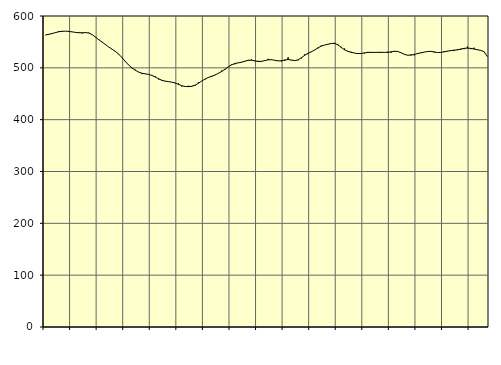
| Category | Piggar | Series 1 |
|---|---|---|
| nan | 563 | 563.58 |
| 87.0 | 565.1 | 564.72 |
| 87.0 | 565.5 | 566.22 |
| 87.0 | 567.5 | 568.09 |
| nan | 571.1 | 569.68 |
| 88.0 | 569.2 | 570.53 |
| 88.0 | 570.7 | 570.74 |
| 88.0 | 571.1 | 570.26 |
| nan | 569.1 | 569.36 |
| 89.0 | 568.6 | 568.34 |
| 89.0 | 568.3 | 567.7 |
| 89.0 | 566.3 | 567.71 |
| nan | 568.4 | 567.95 |
| 90.0 | 567.9 | 567.22 |
| 90.0 | 564.4 | 564.16 |
| 90.0 | 558.9 | 559.25 |
| nan | 553.6 | 554.25 |
| 91.0 | 550.2 | 549.6 |
| 91.0 | 545.5 | 544.87 |
| 91.0 | 540.1 | 540.17 |
| nan | 536.1 | 535.91 |
| 92.0 | 530.5 | 531.68 |
| 92.0 | 527 | 526.33 |
| 92.0 | 520.4 | 519.63 |
| nan | 511.3 | 512.28 |
| 93.0 | 505.6 | 505.3 |
| 93.0 | 499.1 | 499.74 |
| 93.0 | 496.4 | 495.35 |
| nan | 491.6 | 491.84 |
| 94.0 | 487.9 | 489.57 |
| 94.0 | 488.9 | 488.36 |
| 94.0 | 487.1 | 487.36 |
| nan | 484.8 | 485.33 |
| 95.0 | 483.7 | 482.29 |
| 95.0 | 477.7 | 478.91 |
| 95.0 | 475.1 | 476 |
| nan | 473.9 | 474.36 |
| 96.0 | 473.2 | 473.39 |
| 96.0 | 472.1 | 472.38 |
| 96.0 | 470.3 | 470.75 |
| nan | 470 | 468.12 |
| 97.0 | 464.1 | 465.45 |
| 97.0 | 463.6 | 464.02 |
| 97.0 | 465.4 | 463.77 |
| nan | 463.5 | 464.46 |
| 98.0 | 465.1 | 466.51 |
| 98.0 | 472.2 | 470.24 |
| 98.0 | 474.5 | 474.53 |
| nan | 477.5 | 478.4 |
| 99.0 | 482.3 | 481.45 |
| 99.0 | 482.5 | 483.8 |
| 99.0 | 485.9 | 486.26 |
| nan | 489.7 | 489.46 |
| 0.0 | 494.7 | 493 |
| 0.0 | 496.5 | 497.19 |
| 0.0 | 502.2 | 501.86 |
| nan | 506.8 | 505.86 |
| 1.0 | 506.8 | 508.33 |
| 1.0 | 509.3 | 509.55 |
| 1.0 | 510.1 | 510.87 |
| nan | 512.2 | 512.83 |
| 2.0 | 515.3 | 514.49 |
| 2.0 | 516.2 | 514.75 |
| 2.0 | 512.9 | 513.49 |
| nan | 513.6 | 512.19 |
| 3.0 | 511.7 | 512.54 |
| 3.0 | 513.9 | 514.02 |
| 3.0 | 517.4 | 515.45 |
| nan | 515.1 | 515.68 |
| 4.0 | 514.6 | 514.58 |
| 4.0 | 513.5 | 513.42 |
| 4.0 | 512.4 | 513.65 |
| nan | 513.4 | 515.19 |
| 5.0 | 520.5 | 515.99 |
| 5.0 | 514.4 | 515.09 |
| 5.0 | 513.7 | 513.91 |
| nan | 514.5 | 515.3 |
| 6.0 | 518.1 | 519.48 |
| 6.0 | 526 | 524.19 |
| 6.0 | 526.3 | 527.93 |
| nan | 531.6 | 530.85 |
| 7.0 | 534.1 | 534.42 |
| 7.0 | 537.5 | 538.6 |
| 7.0 | 543.2 | 541.97 |
| nan | 543.9 | 544.02 |
| 8.0 | 545.2 | 545.47 |
| 8.0 | 547.2 | 546.99 |
| 8.0 | 548.3 | 547.06 |
| nan | 545.2 | 544.32 |
| 9.0 | 540.4 | 539.35 |
| 9.0 | 537.2 | 534.84 |
| 9.0 | 531.4 | 531.88 |
| nan | 530.9 | 529.93 |
| 10.0 | 528.5 | 528.48 |
| 10.0 | 527.9 | 527.51 |
| 10.0 | 527.2 | 527.7 |
| nan | 527.8 | 528.81 |
| 11.0 | 530.8 | 529.69 |
| 11.0 | 529.2 | 529.9 |
| 11.0 | 529.1 | 529.84 |
| nan | 529.2 | 529.9 |
| 12.0 | 528.9 | 529.92 |
| 12.0 | 529.5 | 529.8 |
| 12.0 | 531.2 | 529.91 |
| nan | 528.9 | 530.79 |
| 13.0 | 532.7 | 531.89 |
| 13.0 | 531 | 531.63 |
| 13.0 | 529.4 | 529.13 |
| nan | 525.7 | 526.04 |
| 14.0 | 524 | 524.4 |
| 14.0 | 525.9 | 524.5 |
| 14.0 | 524.2 | 525.87 |
| nan | 528.7 | 527.55 |
| 15.0 | 529.5 | 528.97 |
| 15.0 | 530.2 | 530.31 |
| 15.0 | 532 | 531.46 |
| nan | 531.8 | 531.77 |
| 16.0 | 529.5 | 530.67 |
| 16.0 | 529.6 | 529.56 |
| 16.0 | 529.3 | 529.73 |
| nan | 532.5 | 530.86 |
| 17.0 | 532.6 | 532.12 |
| 17.0 | 533.9 | 533.18 |
| 17.0 | 532.3 | 534.09 |
| nan | 533.9 | 534.93 |
| 18.0 | 534.6 | 536.28 |
| 18.0 | 536 | 537.56 |
| 18.0 | 541 | 538.04 |
| nan | 536.1 | 537.55 |
| 19.0 | 538.9 | 536.27 |
| 19.0 | 534.4 | 534.89 |
| 19.0 | 534.1 | 533.71 |
| nan | 530.8 | 531.22 |
| 20.0 | 521.5 | 521.54 |